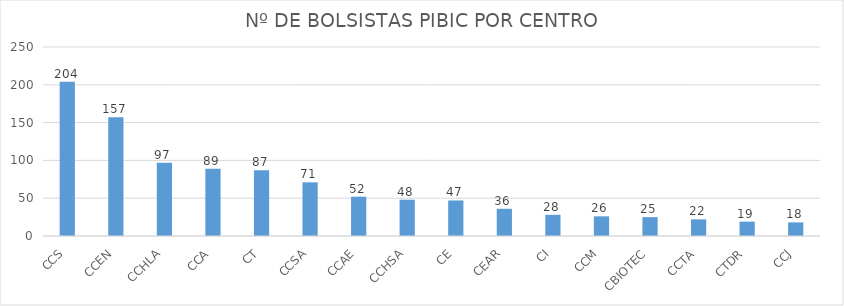
| Category | QTD |
|---|---|
| CCS | 204 |
| CCEN | 157 |
| CCHLA | 97 |
| CCA | 89 |
| CT | 87 |
| CCSA | 71 |
| CCAE | 52 |
| CCHSA | 48 |
| CE | 47 |
| CEAR | 36 |
| CI | 28 |
| CCM | 26 |
| CBIOTEC | 25 |
| CCTA | 22 |
| CTDR | 19 |
| CCJ | 18 |